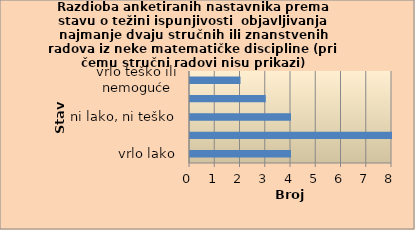
| Category | Series 0 |
|---|---|
| vrlo lako | 4 |
| lako | 8 |
| ni lako, ni teško | 4 |
| teško | 3 |
| vrlo teško ili nemoguće | 2 |